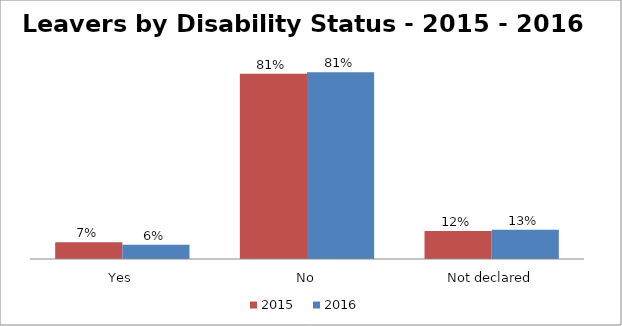
| Category | 2015
 | 2016
 |
|---|---|---|
| Yes | 0.072 | 0.062 |
| No | 0.805 | 0.812 |
| Not declared | 0.122 | 0.127 |